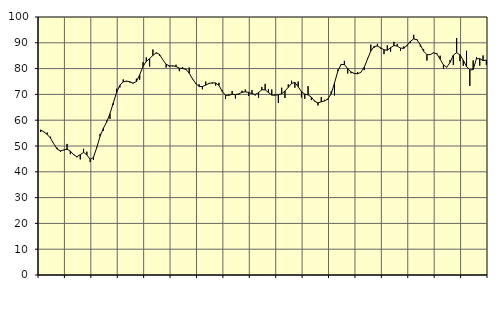
| Category | Piggar | Series 1 |
|---|---|---|
| nan | 55.4 | 56.25 |
| 87.0 | 55.5 | 55.45 |
| 87.0 | 55.2 | 54.48 |
| 87.0 | 53.6 | 53 |
| nan | 50.8 | 50.82 |
| 88.0 | 49.3 | 48.79 |
| 88.0 | 47.7 | 48.13 |
| 88.0 | 48.4 | 48.47 |
| nan | 50.8 | 48.72 |
| 89.0 | 46.8 | 48.03 |
| 89.0 | 46.9 | 46.59 |
| 89.0 | 45.6 | 45.87 |
| nan | 44.8 | 46.64 |
| 90.0 | 48.9 | 47.52 |
| 90.0 | 47.8 | 46.57 |
| 90.0 | 43.8 | 44.8 |
| nan | 44.6 | 45.58 |
| 91.0 | 49.2 | 49.44 |
| 91.0 | 54.7 | 53.76 |
| 91.0 | 55.9 | 56.87 |
| nan | 59.8 | 59.3 |
| 92.0 | 60.5 | 62.55 |
| 92.0 | 65.9 | 66.69 |
| 92.0 | 72.2 | 70.76 |
| nan | 72.7 | 73.61 |
| 93.0 | 75.8 | 74.86 |
| 93.0 | 75 | 75.17 |
| 93.0 | 74.6 | 74.88 |
| nan | 74.2 | 74.39 |
| 94.0 | 76.1 | 74.98 |
| 94.0 | 75.7 | 77.6 |
| 94.0 | 82.5 | 80.82 |
| nan | 84.3 | 82.81 |
| 95.0 | 80.8 | 83.87 |
| 95.0 | 87.4 | 85.09 |
| 95.0 | 85.9 | 86.15 |
| nan | 85 | 85.51 |
| 96.0 | 83.4 | 83.43 |
| 96.0 | 80.4 | 81.68 |
| 96.0 | 80.6 | 81.03 |
| nan | 80.9 | 81.08 |
| 97.0 | 81.5 | 80.82 |
| 97.0 | 79 | 80.17 |
| 97.0 | 80.6 | 80.03 |
| nan | 79.5 | 79.73 |
| 98.0 | 80.4 | 78.2 |
| 98.0 | 75.9 | 76.02 |
| 98.0 | 74.4 | 74.2 |
| nan | 73.9 | 73.1 |
| 99.0 | 72 | 73.06 |
| 99.0 | 75 | 73.61 |
| 99.0 | 74.4 | 74.27 |
| nan | 74.2 | 74.49 |
| 0.0 | 73.4 | 74.42 |
| 0.0 | 74.5 | 73.49 |
| 0.0 | 71.6 | 71.17 |
| nan | 68.2 | 69.64 |
| 1.0 | 70.1 | 69.68 |
| 1.0 | 71.3 | 70.01 |
| 1.0 | 68.4 | 69.91 |
| nan | 69.9 | 70.2 |
| 2.0 | 71.4 | 70.86 |
| 2.0 | 71.9 | 71 |
| 2.0 | 69.4 | 70.78 |
| nan | 71.7 | 70.28 |
| 3.0 | 69.6 | 69.96 |
| 3.0 | 68.7 | 70.72 |
| 3.0 | 72.9 | 71.78 |
| nan | 74.1 | 71.79 |
| 4.0 | 72.1 | 70.73 |
| 4.0 | 71.9 | 69.72 |
| 4.0 | 70 | 69.68 |
| nan | 66.7 | 69.89 |
| 5.0 | 72.6 | 70.22 |
| 5.0 | 68.6 | 71.31 |
| 5.0 | 73.9 | 72.74 |
| nan | 75.3 | 74.24 |
| 6.0 | 72.6 | 74.65 |
| 6.0 | 75 | 73.01 |
| 6.0 | 68.8 | 71.06 |
| nan | 68.3 | 70.11 |
| 7.0 | 73.2 | 69.82 |
| 7.0 | 67.8 | 68.94 |
| 7.0 | 67.6 | 67.33 |
| nan | 65.7 | 66.72 |
| 8.0 | 69 | 67.14 |
| 8.0 | 67.9 | 67.48 |
| 8.0 | 67.9 | 68.23 |
| nan | 71.2 | 70.26 |
| 9.0 | 69.6 | 74.36 |
| 9.0 | 79.6 | 78.98 |
| 9.0 | 81.8 | 81.6 |
| nan | 83 | 81.55 |
| 10.0 | 78.1 | 80.02 |
| 10.0 | 78.2 | 78.7 |
| 10.0 | 78 | 78.12 |
| nan | 78.6 | 77.98 |
| 11.0 | 78.6 | 78.56 |
| 11.0 | 79.4 | 80.49 |
| 11.0 | 84.1 | 83.67 |
| nan | 89.3 | 86.79 |
| 12.0 | 88 | 88.56 |
| 12.0 | 89.6 | 88.72 |
| 12.0 | 87.7 | 88.06 |
| nan | 85.6 | 87.29 |
| 13.0 | 89 | 87.11 |
| 13.0 | 86.6 | 88.11 |
| 13.0 | 90.4 | 88.94 |
| nan | 89.5 | 88.73 |
| 14.0 | 86.9 | 87.97 |
| 14.0 | 88.6 | 87.85 |
| 14.0 | 88.7 | 89.03 |
| nan | 89.9 | 90.59 |
| 15.0 | 93.1 | 91.5 |
| 15.0 | 91.4 | 91.16 |
| 15.0 | 88.6 | 89.25 |
| nan | 87.5 | 86.74 |
| 16.0 | 83.1 | 85.42 |
| 16.0 | 85.6 | 85.42 |
| 16.0 | 86.3 | 86.14 |
| nan | 86 | 85.7 |
| 17.0 | 85 | 83.69 |
| 17.0 | 80 | 81.46 |
| 17.0 | 80.6 | 80.52 |
| nan | 83.3 | 82.36 |
| 18.0 | 81.4 | 85.21 |
| 18.0 | 91.8 | 86.15 |
| 18.0 | 82.9 | 85.34 |
| nan | 81.1 | 83.27 |
| 19.0 | 86.9 | 80.81 |
| 19.0 | 73.3 | 79.51 |
| 19.0 | 83.2 | 79.62 |
| nan | 84.4 | 83.84 |
| 20.0 | 81.1 | 83.87 |
| 20.0 | 85.1 | 83.11 |
| 20.0 | 81.5 | 83.29 |